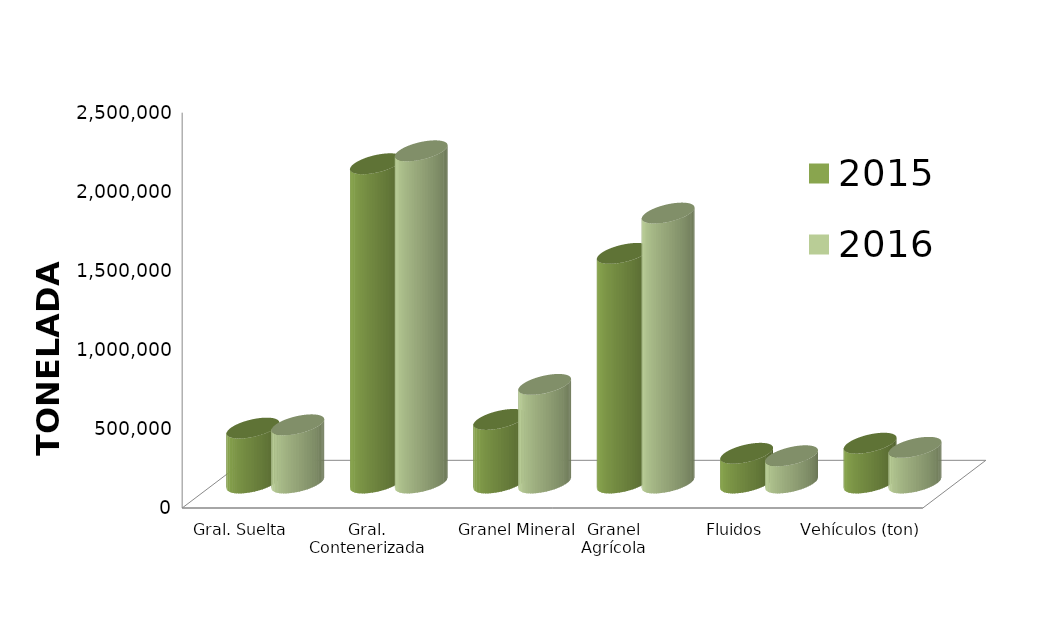
| Category | 2015 | 2016 |
|---|---|---|
| Gral. Suelta | 347288.006 | 367947.357 |
| Gral. Contenerizada | 2018827.579 | 2100850.93 |
| Granel Mineral | 401924.06 | 623439.164 |
| Granel Agrícola | 1451917.535 | 1707019.513 |
| Fluidos | 187822.219 | 172289.178 |
| Vehículos (ton) | 251680.851 | 225536.951 |